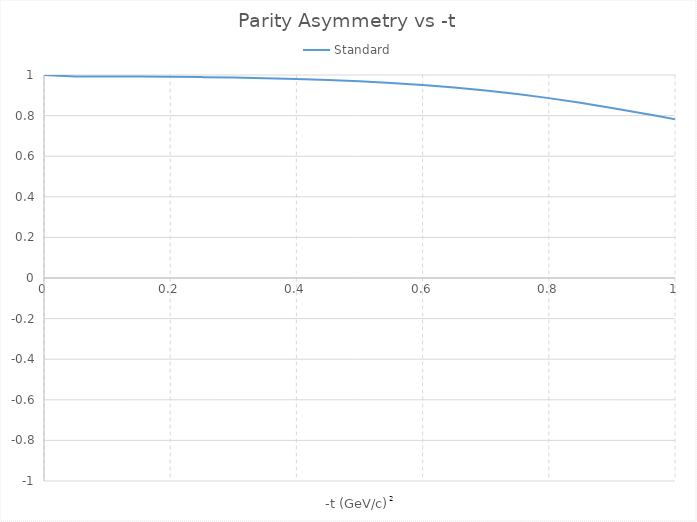
| Category | Standard |
|---|---|
| 0.0 | 1 |
| 0.05 | 0.993 |
| 0.1 | 0.993 |
| 0.15 | 0.992 |
| 0.2 | 0.991 |
| 0.25 | 0.99 |
| 0.3 | 0.987 |
| 0.35 | 0.984 |
| 0.4 | 0.98 |
| 0.45 | 0.976 |
| 0.5 | 0.969 |
| 0.55 | 0.961 |
| 0.6 | 0.951 |
| 0.65 | 0.939 |
| 0.7 | 0.924 |
| 0.75 | 0.906 |
| 0.8 | 0.886 |
| 0.85 | 0.863 |
| 0.9 | 0.838 |
| 0.95 | 0.811 |
| 1.0 | 0.782 |